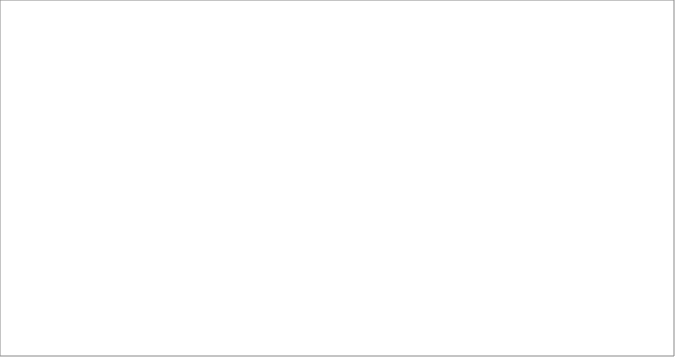
| Category | 2008 | 2009 | 2010 | 2011 | 2012 | 2013 |
|---|---|---|---|---|---|---|
| mazowieckie | 363 | 785 | 393 | 72 | 50 | 55 |